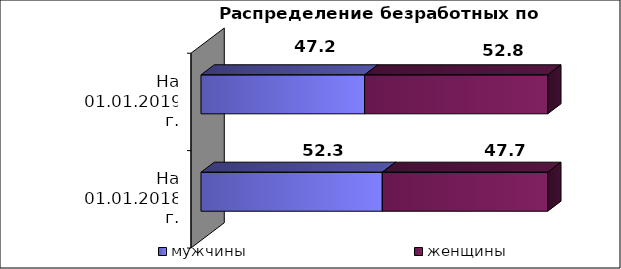
| Category | мужчины  | женщины  |
|---|---|---|
| На 01.01.2018 г. | 52.3 | 47.7 |
| На 01.01.2019 г. | 47.2 | 52.8 |